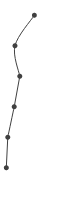
| Category | Series 0 |
|---|---|
| 0.46437276115908516 | 1 |
| 0.14586564598476928 | 2 |
| 0.2250047475803207 | 3 |
| 0.13349855107798458 | 4 |
| 0.027569118203841253 | 5 |
| 0.003613414465686034 | 6 |